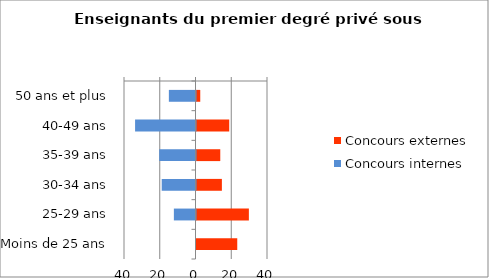
| Category | Concours externes | Concours internes |
|---|---|---|
| 50 ans et plus | 2.1 | -14.9 |
| 40-49 ans | 18.3 | -33.8 |
| 35-39 ans | 13.3 | -20.3 |
| 30-34 ans | 14.2 | -18.9 |
| 25-29 ans | 29.3 | -12.1 |
| Moins de 25 ans | 22.8 | 0 |